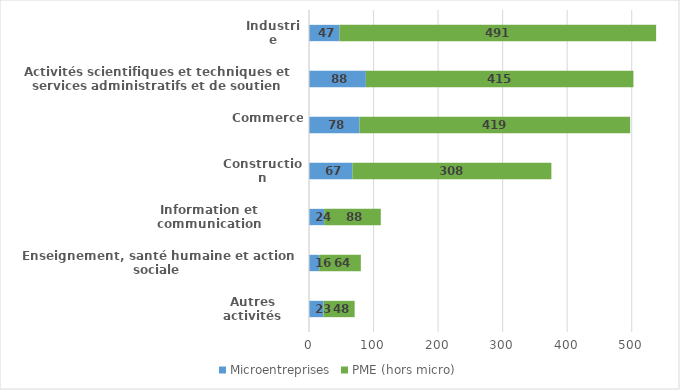
| Category | Microentreprises | PME (hors micro) |
|---|---|---|
| Autres activités | 22.5 | 48.2 |
| Enseignement, santé humaine et action sociale | 15.9 | 64.4 |
| Information et communication | 23.5 | 87.7 |
| Construction | 67.2 | 308.3 |
| Commerce | 78.2 | 419.4 |
| Activités scientifiques et techniques et services administratifs et de soutien | 88.1 | 414.5 |
| Industrie | 47.2 | 490.6 |